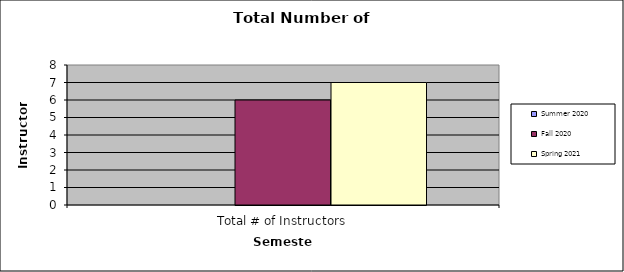
| Category | Summer 2020 | Fall 2020 | Spring 2021 |
|---|---|---|---|
| Total # of Instructors | 0 | 6 | 7 |